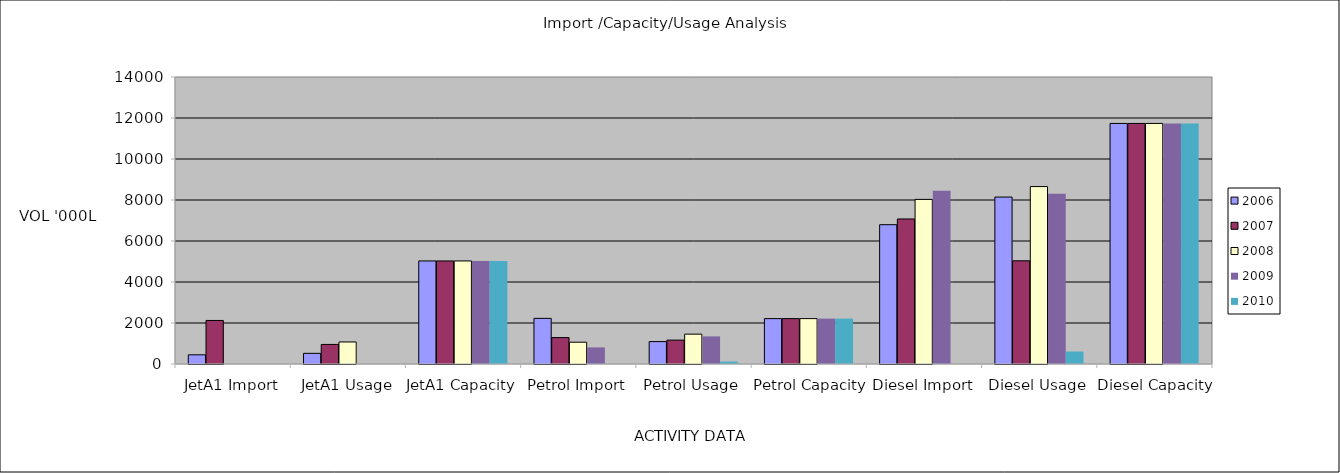
| Category | 2006 | 2007 | 2008 | 2009 | 2010 |
|---|---|---|---|---|---|
| JetA1 Import | 448 | 2124 | 0 | 0 | 0 |
| JetA1 Usage | 520 | 955 | 1074 | 0 | 0 |
| JetA1 Capacity | 5027 | 5027 | 5027 | 5027 | 5027 |
| Petrol Import | 2227 | 1289 | 1063 | 810 | 0 |
| Petrol Usage | 1093 | 1165 | 1456 | 1347 | 120 |
| Petrol Capacity | 2214 | 2214 | 2214 | 2214 | 2214 |
| Diesel Import | 6795 | 7074 | 8029 | 8455 | 0 |
| Diesel Usage | 8144 | 5034 | 8655 | 8308 | 610 |
| Diesel Capacity | 11734 | 11734 | 11734 | 11734 | 11734 |